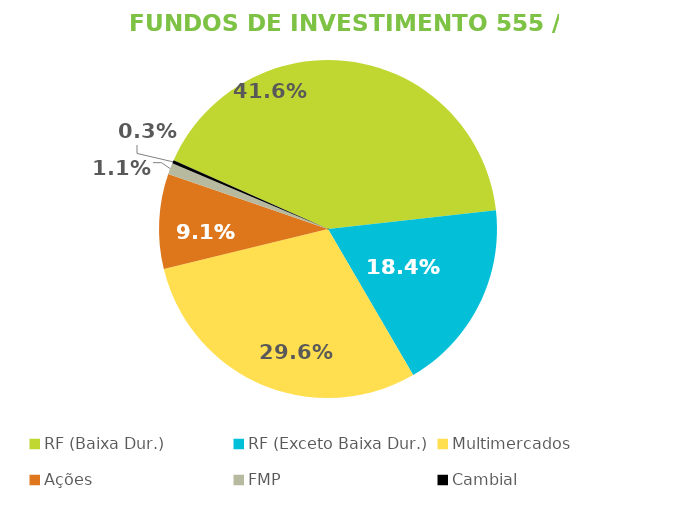
| Category | Fundos de Investimento 555 / FMP |
|---|---|
| RF (Baixa Dur.) | 0.416 |
| RF (Exceto Baixa Dur.) | 0.184 |
| Multimercados | 0.296 |
| Ações | 0.091 |
| FMP | 0.011 |
| Cambial | 0.003 |